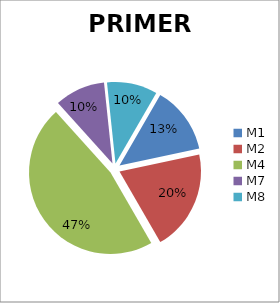
| Category | Series 0 |
|---|---|
| M1 | 128 |
| M2  | 192 |
| M4 | 448 |
| M7 | 96 |
| M8 | 96 |